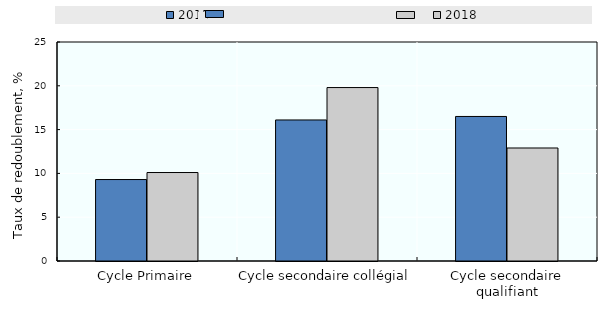
| Category | 2015 | 2018 |
|---|---|---|
| Cycle Primaire | 9.3 | 10.1 |
| Cycle secondaire collégial  | 16.1 | 19.8 |
| Cycle secondaire qualifiant | 16.5 | 12.9 |